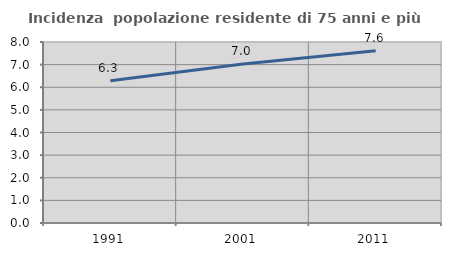
| Category | Incidenza  popolazione residente di 75 anni e più |
|---|---|
| 1991.0 | 6.283 |
| 2001.0 | 7.03 |
| 2011.0 | 7.611 |